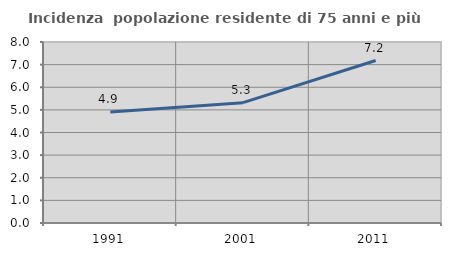
| Category | Incidenza  popolazione residente di 75 anni e più |
|---|---|
| 1991.0 | 4.904 |
| 2001.0 | 5.32 |
| 2011.0 | 7.181 |